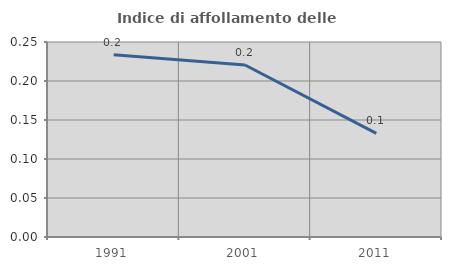
| Category | Indice di affollamento delle abitazioni  |
|---|---|
| 1991.0 | 0.234 |
| 2001.0 | 0.22 |
| 2011.0 | 0.133 |